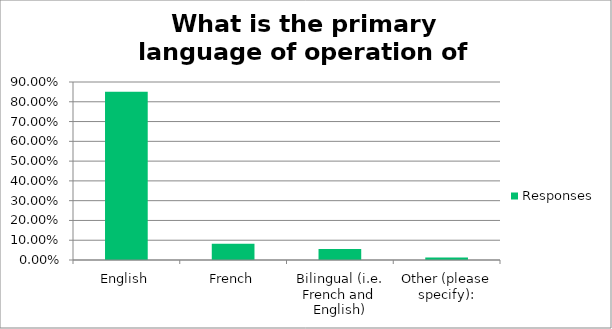
| Category | Responses |
|---|---|
| English | 0.851 |
| French | 0.082 |
| Bilingual (i.e. French and English) | 0.055 |
| Other (please specify): | 0.012 |